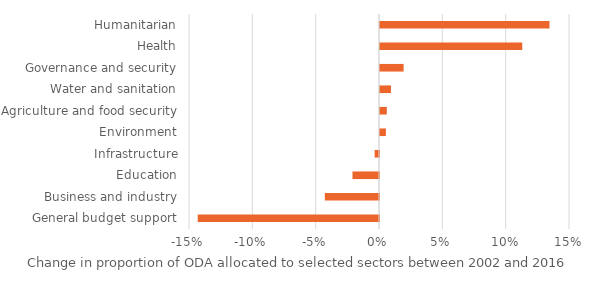
| Category | Series 0 |
|---|---|
| General budget support | -0.143 |
| Business and industry | -0.043 |
| Education | -0.021 |
| Infrastructure | -0.003 |
| Environment | 0.005 |
| Agriculture and food security | 0.005 |
| Water and sanitation | 0.009 |
| Governance and security | 0.019 |
| Health | 0.112 |
| Humanitarian | 0.134 |